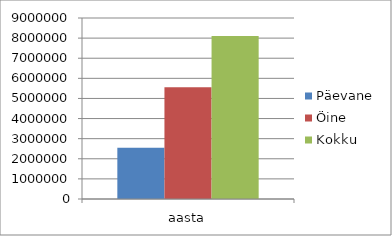
| Category | Päevane | Öine | Kokku |
|---|---|---|---|
| aasta | 2543198.1 | 5560144.8 | 8103342.9 |